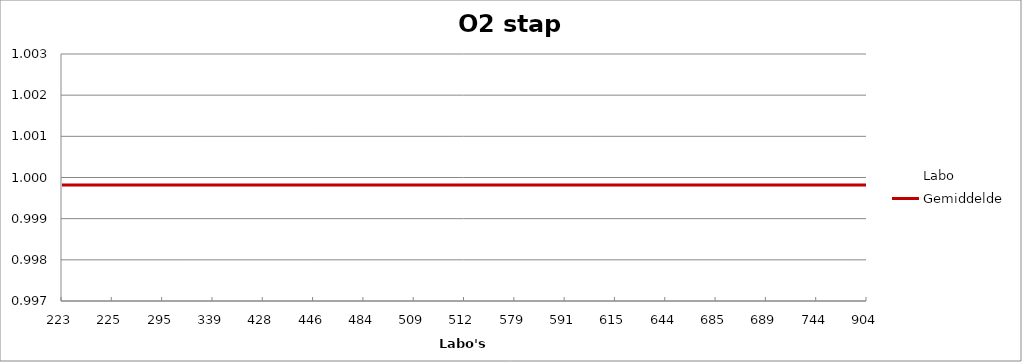
| Category | Labo | Gemiddelde |
|---|---|---|
| 223.0 | 1.001 | 1 |
| 225.0 | 1 | 1 |
| 295.0 | 1 | 1 |
| 339.0 | 1 | 1 |
| 428.0 | 0.999 | 1 |
| 446.0 | 1 | 1 |
| 484.0 | 1.001 | 1 |
| 509.0 | 1 | 1 |
| 512.0 | 1 | 1 |
| 579.0 | 1 | 1 |
| 591.0 | 1 | 1 |
| 615.0 | 0.999 | 1 |
| 644.0 | 1 | 1 |
| 685.0 | 0.999 | 1 |
| 689.0 | 1 | 1 |
| 744.0 | 1 | 1 |
| 904.0 | 0.999 | 1 |